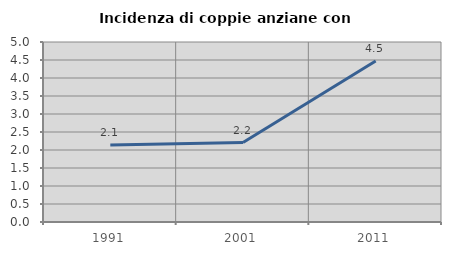
| Category | Incidenza di coppie anziane con figli |
|---|---|
| 1991.0 | 2.141 |
| 2001.0 | 2.208 |
| 2011.0 | 4.471 |